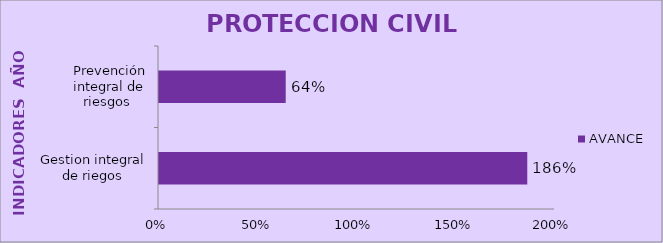
| Category | AVANCE |
|---|---|
| Gestion integral de riegos | 1.86 |
| Prevención integral de riesgos  | 0.64 |